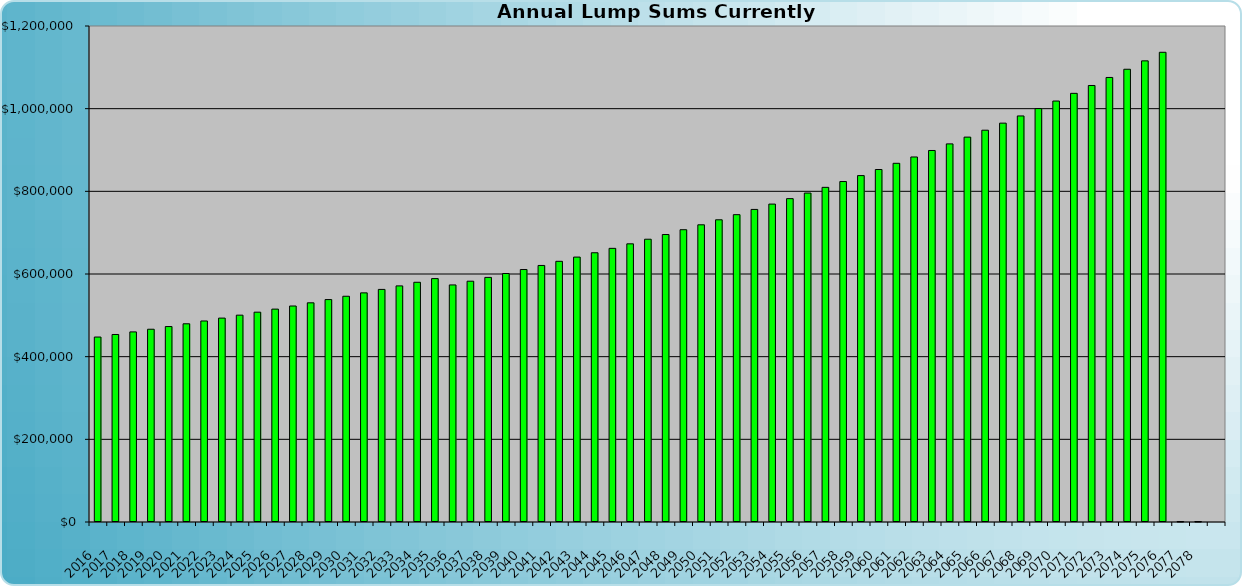
| Category | Amount of Funds Available to Meet All Needs |
|---|---|
| 2016.0 | 447500 |
| 2017.0 | 453650 |
| 2018.0 | 459926.5 |
| 2019.0 | 466332.215 |
| 2020.0 | 472869.921 |
| 2021.0 | 479542.455 |
| 2022.0 | 486352.718 |
| 2023.0 | 493303.678 |
| 2024.0 | 500398.366 |
| 2025.0 | 507639.883 |
| 2026.0 | 515031.399 |
| 2027.0 | 522576.158 |
| 2028.0 | 530277.472 |
| 2029.0 | 538138.732 |
| 2030.0 | 546163.402 |
| 2031.0 | 554355.028 |
| 2032.0 | 562717.233 |
| 2033.0 | 571253.723 |
| 2034.0 | 579968.287 |
| 2035.0 | 588864.802 |
| 2036.0 | 573543.431 |
| 2037.0 | 582571.789 |
| 2038.0 | 591791.82 |
| 2039.0 | 601207.739 |
| 2040.0 | 610823.858 |
| 2041.0 | 620644.587 |
| 2042.0 | 630674.437 |
| 2043.0 | 640918.022 |
| 2044.0 | 651380.063 |
| 2045.0 | 662065.388 |
| 2046.0 | 672978.936 |
| 2047.0 | 684125.761 |
| 2048.0 | 695511.031 |
| 2049.0 | 707140.034 |
| 2050.0 | 719018.18 |
| 2051.0 | 731151.005 |
| 2052.0 | 743544.17 |
| 2053.0 | 756203.469 |
| 2054.0 | 769134.83 |
| 2055.0 | 782344.317 |
| 2056.0 | 795838.135 |
| 2057.0 | 809622.635 |
| 2058.0 | 823704.312 |
| 2059.0 | 838089.814 |
| 2060.0 | 852785.944 |
| 2061.0 | 867799.662 |
| 2062.0 | 883138.092 |
| 2063.0 | 898808.523 |
| 2064.0 | 914818.415 |
| 2065.0 | 931175.401 |
| 2066.0 | 947887.294 |
| 2067.0 | 964962.09 |
| 2068.0 | 982407.972 |
| 2069.0 | 1000233.315 |
| 2070.0 | 1018446.692 |
| 2071.0 | 1037056.875 |
| 2072.0 | 1056072.844 |
| 2073.0 | 1075503.793 |
| 2074.0 | 1095359.128 |
| 2075.0 | 1115648.48 |
| 2076.0 | 1136381.709 |
| 2077.0 | 0 |
| 2078.0 | 0 |